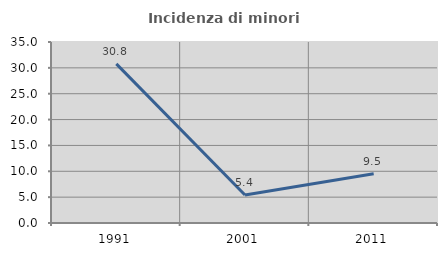
| Category | Incidenza di minori stranieri |
|---|---|
| 1991.0 | 30.769 |
| 2001.0 | 5.405 |
| 2011.0 | 9.524 |